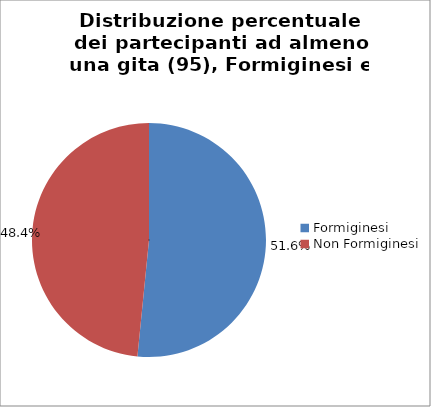
| Category | Nr. Tesserati |
|---|---|
| Formiginesi | 49 |
| Non Formiginesi | 46 |